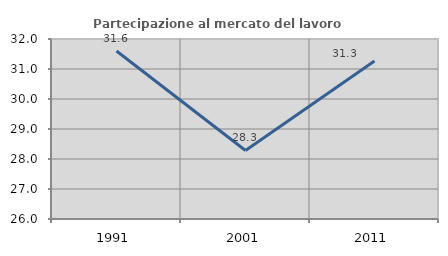
| Category | Partecipazione al mercato del lavoro  femminile |
|---|---|
| 1991.0 | 31.599 |
| 2001.0 | 28.284 |
| 2011.0 | 31.268 |